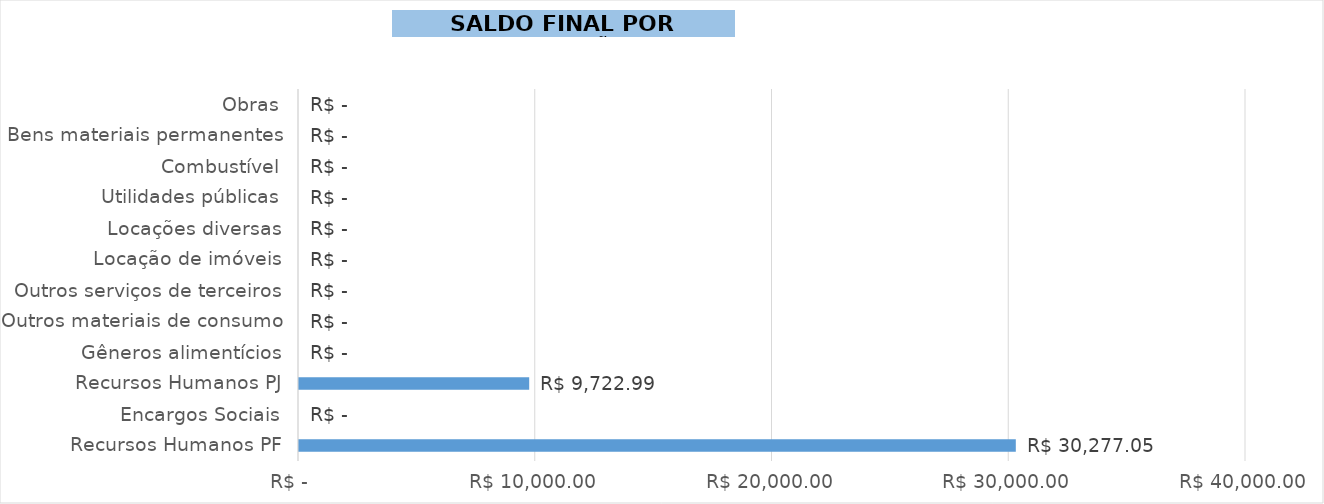
| Category | Saldo Parceria |
|---|---|
| Recursos Humanos PF | 30277.054 |
| Encargos Sociais | 0 |
| Recursos Humanos PJ | 9722.986 |
| Gêneros alimentícios | 0 |
| Outros materiais de consumo | 0 |
| Outros serviços de terceiros | 0 |
| Locação de imóveis | 0 |
| Locações diversas | 0 |
| Utilidades públicas | 0 |
| Combustível | 0 |
| Bens materiais permanentes | 0 |
| Obras | 0 |